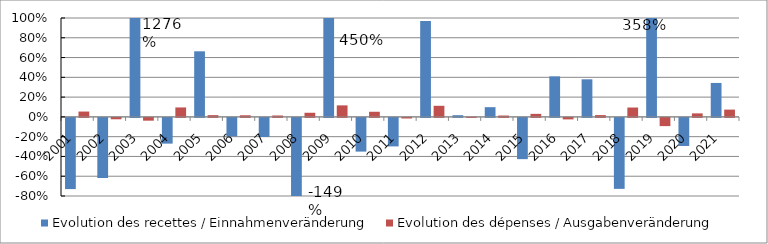
| Category | Evolution des recettes / Einnahmenveränderung | Evolution des dépenses / Ausgabenveränderung |
|---|---|---|
| 2001.0 | -0.72 | 0.054 |
| 2002.0 | -0.608 | -0.014 |
| 2003.0 | 12.764 | -0.028 |
| 2004.0 | -0.26 | 0.096 |
| 2005.0 | 0.663 | 0.018 |
| 2006.0 | -0.187 | 0.016 |
| 2007.0 | -0.193 | 0.014 |
| 2008.0 | -1.491 | 0.042 |
| 2009.0 | 4.496 | 0.116 |
| 2010.0 | -0.341 | 0.052 |
| 2011.0 | -0.288 | -0.006 |
| 2012.0 | 0.969 | 0.112 |
| 2013.0 | 0.017 | 0.002 |
| 2014.0 | 0.098 | 0.014 |
| 2015.0 | -0.417 | 0.031 |
| 2016.0 | 0.41 | -0.015 |
| 2017.0 | 0.38 | 0.018 |
| 2018.0 | -0.718 | 0.095 |
| 2019.0 | 3.576 | -0.083 |
| 2020.0 | -0.284 | 0.035 |
| 2021.0 | 0.343 | 0.074 |